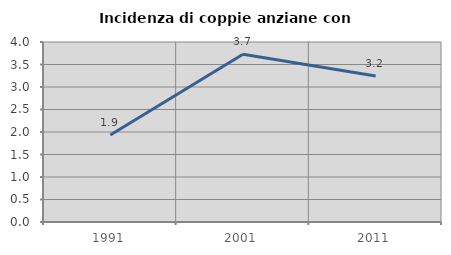
| Category | Incidenza di coppie anziane con figli |
|---|---|
| 1991.0 | 1.932 |
| 2001.0 | 3.728 |
| 2011.0 | 3.245 |